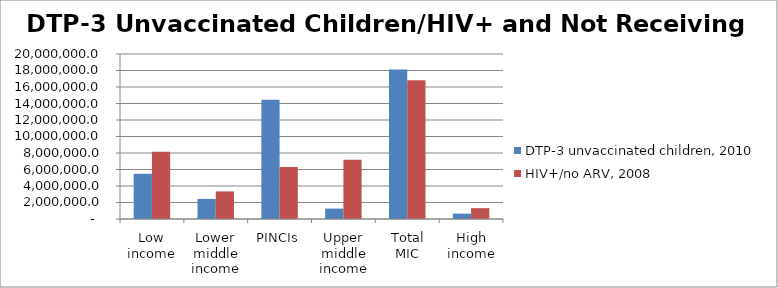
| Category | DTP-3 unvaccinated children, 2010 | HIV+/no ARV, 2008 |
|---|---|---|
| Low income | 5476879 | 8137942 |
| Lower middle income | 2433650 | 3342976 |
| PINCIs | 14439809 | 6315025 |
| Upper middle income | 1261671 | 7170821 |
| Total MIC | 18135130 | 16828822 |
| High income | 652149 | 1314983 |